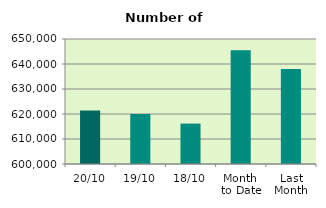
| Category | Series 0 |
|---|---|
| 20/10 | 621422 |
| 19/10 | 620006 |
| 18/10 | 616172 |
| Month 
to Date | 645482.286 |
| Last
Month | 637968.273 |